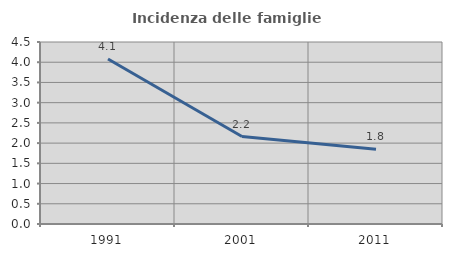
| Category | Incidenza delle famiglie numerose |
|---|---|
| 1991.0 | 4.078 |
| 2001.0 | 2.162 |
| 2011.0 | 1.848 |